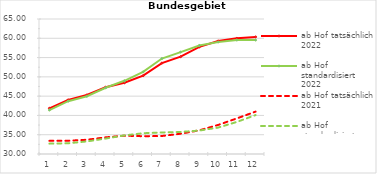
| Category | ab Hof tatsächlich 2022 | ab Hof standardisiert 2022 | ab Hof tatsächlich 2021 | ab Hof standardisiert 2021 |
|---|---|---|---|---|
| 0 | 41.849 | 41.391 | 33.419 | 32.688 |
| 1 | 44.026 | 43.698 | 33.44 | 32.784 |
| 2 | 45.299 | 44.967 | 33.692 | 33.261 |
| 3 | 47.311 | 47.173 | 34.318 | 34.002 |
| 4 | 48.461 | 48.978 | 34.746 | 34.816 |
| 5 | 50.308 | 51.287 | 34.61 | 35.382 |
| 6 | 53.567 | 54.747 | 34.667 | 35.585 |
| 7 | 55.23 | 56.425 | 35.258 | 35.724 |
| 8 | 57.768 | 58.141 | 36.14 | 36.078 |
| 9 | 59.29 | 59.031 | 37.531 | 36.844 |
| 10 | 59.983 | 59.532 | 39.229 | 38.322 |
| 11 | 60.357 | 59.528 | 40.992 | 40.094 |